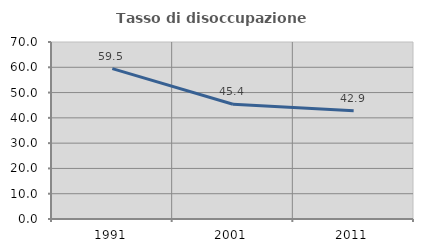
| Category | Tasso di disoccupazione giovanile  |
|---|---|
| 1991.0 | 59.471 |
| 2001.0 | 45.361 |
| 2011.0 | 42.857 |